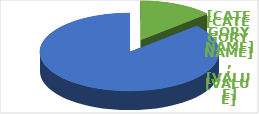
| Category | Series 0 |
|---|---|
| შესრულება | 0.133 |
| დარჩენილი | 0.867 |